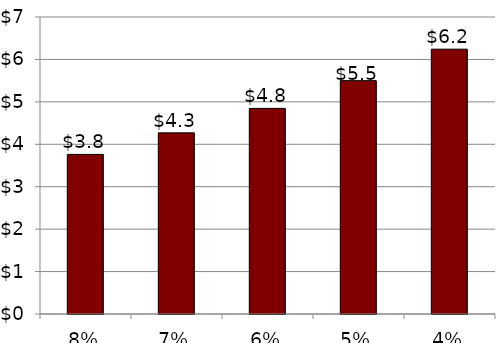
| Category | PBO |
|---|---|
| 0.08 | 3.762 |
| 0.07 | 4.269 |
| 0.06 | 4.846 |
| 0.05 | 5.5 |
| 0.04 | 6.242 |